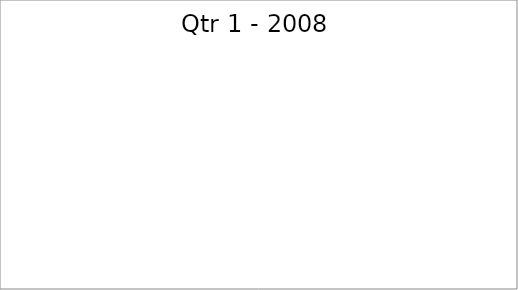
| Category | Series 0 |
|---|---|
| Budget | 1670 |
| Projected | 810 |
| Actual | 2800 |
| Forecast | 900 |